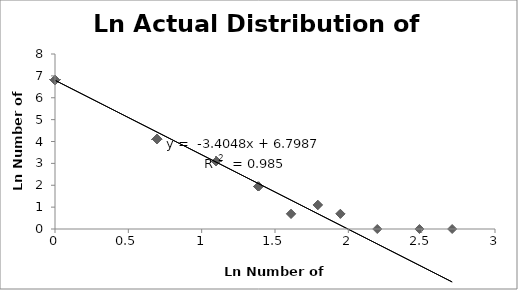
| Category | LnActual Number of Athletes |
|---|---|
| 2.70805 | 0 |
| 2.48491 | 0 |
| 2.19722 | 0 |
| 1.94591 | 0.693 |
| 1.94591 | 0.693 |
| 1.79176 | 1.099 |
| 1.79176 | 1.099 |
| 1.79176 | 1.099 |
| 1.60944 | 0.693 |
| 1.60944 | 0.693 |
| 1.38629 | 1.946 |
| 1.38629 | 1.946 |
| 1.38629 | 1.946 |
| 1.38629 | 1.946 |
| 1.38629 | 1.946 |
| 1.38629 | 1.946 |
| 1.38629 | 1.946 |
| 1.09861 | 3.091 |
| 1.09861 | 3.091 |
| 1.09861 | 3.091 |
| 1.09861 | 3.091 |
| 1.09861 | 3.091 |
| 1.09861 | 3.091 |
| 1.09861 | 3.091 |
| 1.09861 | 3.091 |
| 1.09861 | 3.091 |
| 1.09861 | 3.091 |
| 1.09861 | 3.091 |
| 1.09861 | 3.091 |
| 1.09861 | 3.091 |
| 1.09861 | 3.091 |
| 1.09861 | 3.091 |
| 1.09861 | 3.091 |
| 1.09861 | 3.091 |
| 1.09861 | 3.091 |
| 1.09861 | 3.091 |
| 1.09861 | 3.091 |
| 1.09861 | 3.091 |
| 1.09861 | 3.091 |
| 0.69315 | 4.111 |
| 0.69315 | 4.111 |
| 0.69315 | 4.111 |
| 0.69315 | 4.111 |
| 0.69315 | 4.111 |
| 0.69315 | 4.111 |
| 0.69315 | 4.111 |
| 0.69315 | 4.111 |
| 0.69315 | 4.111 |
| 0.69315 | 4.111 |
| 0.69315 | 4.111 |
| 0.69315 | 4.111 |
| 0.69315 | 4.111 |
| 0.69315 | 4.111 |
| 0.69315 | 4.111 |
| 0.69315 | 4.111 |
| 0.69315 | 4.111 |
| 0.69315 | 4.111 |
| 0.69315 | 4.111 |
| 0.69315 | 4.111 |
| 0.69315 | 4.111 |
| 0.69315 | 4.111 |
| 0.69315 | 4.111 |
| 0.69315 | 4.111 |
| 0.69315 | 4.111 |
| 0.69315 | 4.111 |
| 0.69315 | 4.111 |
| 0.69315 | 4.111 |
| 0.69315 | 4.111 |
| 0.69315 | 4.111 |
| 0.69315 | 4.111 |
| 0.69315 | 4.111 |
| 0.69315 | 4.111 |
| 0.69315 | 4.111 |
| 0.69315 | 4.111 |
| 0.69315 | 4.111 |
| 0.69315 | 4.111 |
| 0.69315 | 4.111 |
| 0.69315 | 4.111 |
| 0.69315 | 4.111 |
| 0.69315 | 4.111 |
| 0.69315 | 4.111 |
| 0.69315 | 4.111 |
| 0.69315 | 4.111 |
| 0.69315 | 4.111 |
| 0.69315 | 4.111 |
| 0.69315 | 4.111 |
| 0.69315 | 4.111 |
| 0.69315 | 4.111 |
| 0.69315 | 4.111 |
| 0.69315 | 4.111 |
| 0.69315 | 4.111 |
| 0.69315 | 4.111 |
| 0.69315 | 4.111 |
| 0.69315 | 4.111 |
| 0.69315 | 4.111 |
| 0.69315 | 4.111 |
| 0.69315 | 4.111 |
| 0.69315 | 4.111 |
| 0.69315 | 4.111 |
| 0.69315 | 4.111 |
| 0.0 | 6.815 |
| 0.0 | 6.815 |
| 0.0 | 6.815 |
| 0.0 | 6.815 |
| 0.0 | 6.815 |
| 0.0 | 6.815 |
| 0.0 | 6.815 |
| 0.0 | 6.815 |
| 0.0 | 6.815 |
| 0.0 | 6.815 |
| 0.0 | 6.815 |
| 0.0 | 6.815 |
| 0.0 | 6.815 |
| 0.0 | 6.815 |
| 0.0 | 6.815 |
| 0.0 | 6.815 |
| 0.0 | 6.815 |
| 0.0 | 6.815 |
| 0.0 | 6.815 |
| 0.0 | 6.815 |
| 0.0 | 6.815 |
| 0.0 | 6.815 |
| 0.0 | 6.815 |
| 0.0 | 6.815 |
| 0.0 | 6.815 |
| 0.0 | 6.815 |
| 0.0 | 6.815 |
| 0.0 | 6.815 |
| 0.0 | 6.815 |
| 0.0 | 6.815 |
| 0.0 | 6.815 |
| 0.0 | 6.815 |
| 0.0 | 6.815 |
| 0.0 | 6.815 |
| 0.0 | 6.815 |
| 0.0 | 6.815 |
| 0.0 | 6.815 |
| 0.0 | 6.815 |
| 0.0 | 6.815 |
| 0.0 | 6.815 |
| 0.0 | 6.815 |
| 0.0 | 6.815 |
| 0.0 | 6.815 |
| 0.0 | 6.815 |
| 0.0 | 6.815 |
| 0.0 | 6.815 |
| 0.0 | 6.815 |
| 0.0 | 6.815 |
| 0.0 | 6.815 |
| 0.0 | 6.815 |
| 0.0 | 6.815 |
| 0.0 | 6.815 |
| 0.0 | 6.815 |
| 0.0 | 6.815 |
| 0.0 | 6.815 |
| 0.0 | 6.815 |
| 0.0 | 6.815 |
| 0.0 | 6.815 |
| 0.0 | 6.815 |
| 0.0 | 6.815 |
| 0.0 | 6.815 |
| 0.0 | 6.815 |
| 0.0 | 6.815 |
| 0.0 | 6.815 |
| 0.0 | 6.815 |
| 0.0 | 6.815 |
| 0.0 | 6.815 |
| 0.0 | 6.815 |
| 0.0 | 6.815 |
| 0.0 | 6.815 |
| 0.0 | 6.815 |
| 0.0 | 6.815 |
| 0.0 | 6.815 |
| 0.0 | 6.815 |
| 0.0 | 6.815 |
| 0.0 | 6.815 |
| 0.0 | 6.815 |
| 0.0 | 6.815 |
| 0.0 | 6.815 |
| 0.0 | 6.815 |
| 0.0 | 6.815 |
| 0.0 | 6.815 |
| 0.0 | 6.815 |
| 0.0 | 6.815 |
| 0.0 | 6.815 |
| 0.0 | 6.815 |
| 0.0 | 6.815 |
| 0.0 | 6.815 |
| 0.0 | 6.815 |
| 0.0 | 6.815 |
| 0.0 | 6.815 |
| 0.0 | 6.815 |
| 0.0 | 6.815 |
| 0.0 | 6.815 |
| 0.0 | 6.815 |
| 0.0 | 6.815 |
| 0.0 | 6.815 |
| 0.0 | 6.815 |
| 0.0 | 6.815 |
| 0.0 | 6.815 |
| 0.0 | 6.815 |
| 0.0 | 6.815 |
| 0.0 | 6.815 |
| 0.0 | 6.815 |
| 0.0 | 6.815 |
| 0.0 | 6.815 |
| 0.0 | 6.815 |
| 0.0 | 6.815 |
| 0.0 | 6.815 |
| 0.0 | 6.815 |
| 0.0 | 6.815 |
| 0.0 | 6.815 |
| 0.0 | 6.815 |
| 0.0 | 6.815 |
| 0.0 | 6.815 |
| 0.0 | 6.815 |
| 0.0 | 6.815 |
| 0.0 | 6.815 |
| 0.0 | 6.815 |
| 0.0 | 6.815 |
| 0.0 | 6.815 |
| 0.0 | 6.815 |
| 0.0 | 6.815 |
| 0.0 | 6.815 |
| 0.0 | 6.815 |
| 0.0 | 6.815 |
| 0.0 | 6.815 |
| 0.0 | 6.815 |
| 0.0 | 6.815 |
| 0.0 | 6.815 |
| 0.0 | 6.815 |
| 0.0 | 6.815 |
| 0.0 | 6.815 |
| 0.0 | 6.815 |
| 0.0 | 6.815 |
| 0.0 | 6.815 |
| 0.0 | 6.815 |
| 0.0 | 6.815 |
| 0.0 | 6.815 |
| 0.0 | 6.815 |
| 0.0 | 6.815 |
| 0.0 | 6.815 |
| 0.0 | 6.815 |
| 0.0 | 6.815 |
| 0.0 | 6.815 |
| 0.0 | 6.815 |
| 0.0 | 6.815 |
| 0.0 | 6.815 |
| 0.0 | 6.815 |
| 0.0 | 6.815 |
| 0.0 | 6.815 |
| 0.0 | 6.815 |
| 0.0 | 6.815 |
| 0.0 | 6.815 |
| 0.0 | 6.815 |
| 0.0 | 6.815 |
| 0.0 | 6.815 |
| 0.0 | 6.815 |
| 0.0 | 6.815 |
| 0.0 | 6.815 |
| 0.0 | 6.815 |
| 0.0 | 6.815 |
| 0.0 | 6.815 |
| 0.0 | 6.815 |
| 0.0 | 6.815 |
| 0.0 | 6.815 |
| 0.0 | 6.815 |
| 0.0 | 6.815 |
| 0.0 | 6.815 |
| 0.0 | 6.815 |
| 0.0 | 6.815 |
| 0.0 | 6.815 |
| 0.0 | 6.815 |
| 0.0 | 6.815 |
| 0.0 | 6.815 |
| 0.0 | 6.815 |
| 0.0 | 6.815 |
| 0.0 | 6.815 |
| 0.0 | 6.815 |
| 0.0 | 6.815 |
| 0.0 | 6.815 |
| 0.0 | 6.815 |
| 0.0 | 6.815 |
| 0.0 | 6.815 |
| 0.0 | 6.815 |
| 0.0 | 6.815 |
| 0.0 | 6.815 |
| 0.0 | 6.815 |
| 0.0 | 6.815 |
| 0.0 | 6.815 |
| 0.0 | 6.815 |
| 0.0 | 6.815 |
| 0.0 | 6.815 |
| 0.0 | 6.815 |
| 0.0 | 6.815 |
| 0.0 | 6.815 |
| 0.0 | 6.815 |
| 0.0 | 6.815 |
| 0.0 | 6.815 |
| 0.0 | 6.815 |
| 0.0 | 6.815 |
| 0.0 | 6.815 |
| 0.0 | 6.815 |
| 0.0 | 6.815 |
| 0.0 | 6.815 |
| 0.0 | 6.815 |
| 0.0 | 6.815 |
| 0.0 | 6.815 |
| 0.0 | 6.815 |
| 0.0 | 6.815 |
| 0.0 | 6.815 |
| 0.0 | 6.815 |
| 0.0 | 6.815 |
| 0.0 | 6.815 |
| 0.0 | 6.815 |
| 0.0 | 6.815 |
| 0.0 | 6.815 |
| 0.0 | 6.815 |
| 0.0 | 6.815 |
| 0.0 | 6.815 |
| 0.0 | 6.815 |
| 0.0 | 6.815 |
| 0.0 | 6.815 |
| 0.0 | 6.815 |
| 0.0 | 6.815 |
| 0.0 | 6.815 |
| 0.0 | 6.815 |
| 0.0 | 6.815 |
| 0.0 | 6.815 |
| 0.0 | 6.815 |
| 0.0 | 6.815 |
| 0.0 | 6.815 |
| 0.0 | 6.815 |
| 0.0 | 6.815 |
| 0.0 | 6.815 |
| 0.0 | 6.815 |
| 0.0 | 6.815 |
| 0.0 | 6.815 |
| 0.0 | 6.815 |
| 0.0 | 6.815 |
| 0.0 | 6.815 |
| 0.0 | 6.815 |
| 0.0 | 6.815 |
| 0.0 | 6.815 |
| 0.0 | 6.815 |
| 0.0 | 6.815 |
| 0.0 | 6.815 |
| 0.0 | 6.815 |
| 0.0 | 6.815 |
| 0.0 | 6.815 |
| 0.0 | 6.815 |
| 0.0 | 6.815 |
| 0.0 | 6.815 |
| 0.0 | 6.815 |
| 0.0 | 6.815 |
| 0.0 | 6.815 |
| 0.0 | 6.815 |
| 0.0 | 6.815 |
| 0.0 | 6.815 |
| 0.0 | 6.815 |
| 0.0 | 6.815 |
| 0.0 | 6.815 |
| 0.0 | 6.815 |
| 0.0 | 6.815 |
| 0.0 | 6.815 |
| 0.0 | 6.815 |
| 0.0 | 6.815 |
| 0.0 | 6.815 |
| 0.0 | 6.815 |
| 0.0 | 6.815 |
| 0.0 | 6.815 |
| 0.0 | 6.815 |
| 0.0 | 6.815 |
| 0.0 | 6.815 |
| 0.0 | 6.815 |
| 0.0 | 6.815 |
| 0.0 | 6.815 |
| 0.0 | 6.815 |
| 0.0 | 6.815 |
| 0.0 | 6.815 |
| 0.0 | 6.815 |
| 0.0 | 6.815 |
| 0.0 | 6.815 |
| 0.0 | 6.815 |
| 0.0 | 6.815 |
| 0.0 | 6.815 |
| 0.0 | 6.815 |
| 0.0 | 6.815 |
| 0.0 | 6.815 |
| 0.0 | 6.815 |
| 0.0 | 6.815 |
| 0.0 | 6.815 |
| 0.0 | 6.815 |
| 0.0 | 6.815 |
| 0.0 | 6.815 |
| 0.0 | 6.815 |
| 0.0 | 6.815 |
| 0.0 | 6.815 |
| 0.0 | 6.815 |
| 0.0 | 6.815 |
| 0.0 | 6.815 |
| 0.0 | 6.815 |
| 0.0 | 6.815 |
| 0.0 | 6.815 |
| 0.0 | 6.815 |
| 0.0 | 6.815 |
| 0.0 | 6.815 |
| 0.0 | 6.815 |
| 0.0 | 6.815 |
| 0.0 | 6.815 |
| 0.0 | 6.815 |
| 0.0 | 6.815 |
| 0.0 | 6.815 |
| 0.0 | 6.815 |
| 0.0 | 6.815 |
| 0.0 | 6.815 |
| 0.0 | 6.815 |
| 0.0 | 6.815 |
| 0.0 | 6.815 |
| 0.0 | 6.815 |
| 0.0 | 6.815 |
| 0.0 | 6.815 |
| 0.0 | 6.815 |
| 0.0 | 6.815 |
| 0.0 | 6.815 |
| 0.0 | 6.815 |
| 0.0 | 6.815 |
| 0.0 | 6.815 |
| 0.0 | 6.815 |
| 0.0 | 6.815 |
| 0.0 | 6.815 |
| 0.0 | 6.815 |
| 0.0 | 6.815 |
| 0.0 | 6.815 |
| 0.0 | 6.815 |
| 0.0 | 6.815 |
| 0.0 | 6.815 |
| 0.0 | 6.815 |
| 0.0 | 6.815 |
| 0.0 | 6.815 |
| 0.0 | 6.815 |
| 0.0 | 6.815 |
| 0.0 | 6.815 |
| 0.0 | 6.815 |
| 0.0 | 6.815 |
| 0.0 | 6.815 |
| 0.0 | 6.815 |
| 0.0 | 6.815 |
| 0.0 | 6.815 |
| 0.0 | 6.815 |
| 0.0 | 6.815 |
| 0.0 | 6.815 |
| 0.0 | 6.815 |
| 0.0 | 6.815 |
| 0.0 | 6.815 |
| 0.0 | 6.815 |
| 0.0 | 6.815 |
| 0.0 | 6.815 |
| 0.0 | 6.815 |
| 0.0 | 6.815 |
| 0.0 | 6.815 |
| 0.0 | 6.815 |
| 0.0 | 6.815 |
| 0.0 | 6.815 |
| 0.0 | 6.815 |
| 0.0 | 6.815 |
| 0.0 | 6.815 |
| 0.0 | 6.815 |
| 0.0 | 6.815 |
| 0.0 | 6.815 |
| 0.0 | 6.815 |
| 0.0 | 6.815 |
| 0.0 | 6.815 |
| 0.0 | 6.815 |
| 0.0 | 6.815 |
| 0.0 | 6.815 |
| 0.0 | 6.815 |
| 0.0 | 6.815 |
| 0.0 | 6.815 |
| 0.0 | 6.815 |
| 0.0 | 6.815 |
| 0.0 | 6.815 |
| 0.0 | 6.815 |
| 0.0 | 6.815 |
| 0.0 | 6.815 |
| 0.0 | 6.815 |
| 0.0 | 6.815 |
| 0.0 | 6.815 |
| 0.0 | 6.815 |
| 0.0 | 6.815 |
| 0.0 | 6.815 |
| 0.0 | 6.815 |
| 0.0 | 6.815 |
| 0.0 | 6.815 |
| 0.0 | 6.815 |
| 0.0 | 6.815 |
| 0.0 | 6.815 |
| 0.0 | 6.815 |
| 0.0 | 6.815 |
| 0.0 | 6.815 |
| 0.0 | 6.815 |
| 0.0 | 6.815 |
| 0.0 | 6.815 |
| 0.0 | 6.815 |
| 0.0 | 6.815 |
| 0.0 | 6.815 |
| 0.0 | 6.815 |
| 0.0 | 6.815 |
| 0.0 | 6.815 |
| 0.0 | 6.815 |
| 0.0 | 6.815 |
| 0.0 | 6.815 |
| 0.0 | 6.815 |
| 0.0 | 6.815 |
| 0.0 | 6.815 |
| 0.0 | 6.815 |
| 0.0 | 6.815 |
| 0.0 | 6.815 |
| 0.0 | 6.815 |
| 0.0 | 6.815 |
| 0.0 | 6.815 |
| 0.0 | 6.815 |
| 0.0 | 6.815 |
| 0.0 | 6.815 |
| 0.0 | 6.815 |
| 0.0 | 6.815 |
| 0.0 | 6.815 |
| 0.0 | 6.815 |
| 0.0 | 6.815 |
| 0.0 | 6.815 |
| 0.0 | 6.815 |
| 0.0 | 6.815 |
| 0.0 | 6.815 |
| 0.0 | 6.815 |
| 0.0 | 6.815 |
| 0.0 | 6.815 |
| 0.0 | 6.815 |
| 0.0 | 6.815 |
| 0.0 | 6.815 |
| 0.0 | 6.815 |
| 0.0 | 6.815 |
| 0.0 | 6.815 |
| 0.0 | 6.815 |
| 0.0 | 6.815 |
| 0.0 | 6.815 |
| 0.0 | 6.815 |
| 0.0 | 6.815 |
| 0.0 | 6.815 |
| 0.0 | 6.815 |
| 0.0 | 6.815 |
| 0.0 | 6.815 |
| 0.0 | 6.815 |
| 0.0 | 6.815 |
| 0.0 | 6.815 |
| 0.0 | 6.815 |
| 0.0 | 6.815 |
| 0.0 | 6.815 |
| 0.0 | 6.815 |
| 0.0 | 6.815 |
| 0.0 | 6.815 |
| 0.0 | 6.815 |
| 0.0 | 6.815 |
| 0.0 | 6.815 |
| 0.0 | 6.815 |
| 0.0 | 6.815 |
| 0.0 | 6.815 |
| 0.0 | 6.815 |
| 0.0 | 6.815 |
| 0.0 | 6.815 |
| 0.0 | 6.815 |
| 0.0 | 6.815 |
| 0.0 | 6.815 |
| 0.0 | 6.815 |
| 0.0 | 6.815 |
| 0.0 | 6.815 |
| 0.0 | 6.815 |
| 0.0 | 6.815 |
| 0.0 | 6.815 |
| 0.0 | 6.815 |
| 0.0 | 6.815 |
| 0.0 | 6.815 |
| 0.0 | 6.815 |
| 0.0 | 6.815 |
| 0.0 | 6.815 |
| 0.0 | 6.815 |
| 0.0 | 6.815 |
| 0.0 | 6.815 |
| 0.0 | 6.815 |
| 0.0 | 6.815 |
| 0.0 | 6.815 |
| 0.0 | 6.815 |
| 0.0 | 6.815 |
| 0.0 | 6.815 |
| 0.0 | 6.815 |
| 0.0 | 6.815 |
| 0.0 | 6.815 |
| 0.0 | 6.815 |
| 0.0 | 6.815 |
| 0.0 | 6.815 |
| 0.0 | 6.815 |
| 0.0 | 6.815 |
| 0.0 | 6.815 |
| 0.0 | 6.815 |
| 0.0 | 6.815 |
| 0.0 | 6.815 |
| 0.0 | 6.815 |
| 0.0 | 6.815 |
| 0.0 | 6.815 |
| 0.0 | 6.815 |
| 0.0 | 6.815 |
| 0.0 | 6.815 |
| 0.0 | 6.815 |
| 0.0 | 6.815 |
| 0.0 | 6.815 |
| 0.0 | 6.815 |
| 0.0 | 6.815 |
| 0.0 | 6.815 |
| 0.0 | 6.815 |
| 0.0 | 6.815 |
| 0.0 | 6.815 |
| 0.0 | 6.815 |
| 0.0 | 6.815 |
| 0.0 | 6.815 |
| 0.0 | 6.815 |
| 0.0 | 6.815 |
| 0.0 | 6.815 |
| 0.0 | 6.815 |
| 0.0 | 6.815 |
| 0.0 | 6.815 |
| 0.0 | 6.815 |
| 0.0 | 6.815 |
| 0.0 | 6.815 |
| 0.0 | 6.815 |
| 0.0 | 6.815 |
| 0.0 | 6.815 |
| 0.0 | 6.815 |
| 0.0 | 6.815 |
| 0.0 | 6.815 |
| 0.0 | 6.815 |
| 0.0 | 6.815 |
| 0.0 | 6.815 |
| 0.0 | 6.815 |
| 0.0 | 6.815 |
| 0.0 | 6.815 |
| 0.0 | 6.815 |
| 0.0 | 6.815 |
| 0.0 | 6.815 |
| 0.0 | 6.815 |
| 0.0 | 6.815 |
| 0.0 | 6.815 |
| 0.0 | 6.815 |
| 0.0 | 6.815 |
| 0.0 | 6.815 |
| 0.0 | 6.815 |
| 0.0 | 6.815 |
| 0.0 | 6.815 |
| 0.0 | 6.815 |
| 0.0 | 6.815 |
| 0.0 | 6.815 |
| 0.0 | 6.815 |
| 0.0 | 6.815 |
| 0.0 | 6.815 |
| 0.0 | 6.815 |
| 0.0 | 6.815 |
| 0.0 | 6.815 |
| 0.0 | 6.815 |
| 0.0 | 6.815 |
| 0.0 | 6.815 |
| 0.0 | 6.815 |
| 0.0 | 6.815 |
| 0.0 | 6.815 |
| 0.0 | 6.815 |
| 0.0 | 6.815 |
| 0.0 | 6.815 |
| 0.0 | 6.815 |
| 0.0 | 6.815 |
| 0.0 | 6.815 |
| 0.0 | 6.815 |
| 0.0 | 6.815 |
| 0.0 | 6.815 |
| 0.0 | 6.815 |
| 0.0 | 6.815 |
| 0.0 | 6.815 |
| 0.0 | 6.815 |
| 0.0 | 6.815 |
| 0.0 | 6.815 |
| 0.0 | 6.815 |
| 0.0 | 6.815 |
| 0.0 | 6.815 |
| 0.0 | 6.815 |
| 0.0 | 6.815 |
| 0.0 | 6.815 |
| 0.0 | 6.815 |
| 0.0 | 6.815 |
| 0.0 | 6.815 |
| 0.0 | 6.815 |
| 0.0 | 6.815 |
| 0.0 | 6.815 |
| 0.0 | 6.815 |
| 0.0 | 6.815 |
| 0.0 | 6.815 |
| 0.0 | 6.815 |
| 0.0 | 6.815 |
| 0.0 | 6.815 |
| 0.0 | 6.815 |
| 0.0 | 6.815 |
| 0.0 | 6.815 |
| 0.0 | 6.815 |
| 0.0 | 6.815 |
| 0.0 | 6.815 |
| 0.0 | 6.815 |
| 0.0 | 6.815 |
| 0.0 | 6.815 |
| 0.0 | 6.815 |
| 0.0 | 6.815 |
| 0.0 | 6.815 |
| 0.0 | 6.815 |
| 0.0 | 6.815 |
| 0.0 | 6.815 |
| 0.0 | 6.815 |
| 0.0 | 6.815 |
| 0.0 | 6.815 |
| 0.0 | 6.815 |
| 0.0 | 6.815 |
| 0.0 | 6.815 |
| 0.0 | 6.815 |
| 0.0 | 6.815 |
| 0.0 | 6.815 |
| 0.0 | 6.815 |
| 0.0 | 6.815 |
| 0.0 | 6.815 |
| 0.0 | 6.815 |
| 0.0 | 6.815 |
| 0.0 | 6.815 |
| 0.0 | 6.815 |
| 0.0 | 6.815 |
| 0.0 | 6.815 |
| 0.0 | 6.815 |
| 0.0 | 6.815 |
| 0.0 | 6.815 |
| 0.0 | 6.815 |
| 0.0 | 6.815 |
| 0.0 | 6.815 |
| 0.0 | 6.815 |
| 0.0 | 6.815 |
| 0.0 | 6.815 |
| 0.0 | 6.815 |
| 0.0 | 6.815 |
| 0.0 | 6.815 |
| 0.0 | 6.815 |
| 0.0 | 6.815 |
| 0.0 | 6.815 |
| 0.0 | 6.815 |
| 0.0 | 6.815 |
| 0.0 | 6.815 |
| 0.0 | 6.815 |
| 0.0 | 6.815 |
| 0.0 | 6.815 |
| 0.0 | 6.815 |
| 0.0 | 6.815 |
| 0.0 | 6.815 |
| 0.0 | 6.815 |
| 0.0 | 6.815 |
| 0.0 | 6.815 |
| 0.0 | 6.815 |
| 0.0 | 6.815 |
| 0.0 | 6.815 |
| 0.0 | 6.815 |
| 0.0 | 6.815 |
| 0.0 | 6.815 |
| 0.0 | 6.815 |
| 0.0 | 6.815 |
| 0.0 | 6.815 |
| 0.0 | 6.815 |
| 0.0 | 6.815 |
| 0.0 | 6.815 |
| 0.0 | 6.815 |
| 0.0 | 6.815 |
| 0.0 | 6.815 |
| 0.0 | 6.815 |
| 0.0 | 6.815 |
| 0.0 | 6.815 |
| 0.0 | 6.815 |
| 0.0 | 6.815 |
| 0.0 | 6.815 |
| 0.0 | 6.815 |
| 0.0 | 6.815 |
| 0.0 | 6.815 |
| 0.0 | 6.815 |
| 0.0 | 6.815 |
| 0.0 | 6.815 |
| 0.0 | 6.815 |
| 0.0 | 6.815 |
| 0.0 | 6.815 |
| 0.0 | 6.815 |
| 0.0 | 6.815 |
| 0.0 | 6.815 |
| 0.0 | 6.815 |
| 0.0 | 6.815 |
| 0.0 | 6.815 |
| 0.0 | 6.815 |
| 0.0 | 6.815 |
| 0.0 | 6.815 |
| 0.0 | 6.815 |
| 0.0 | 6.815 |
| 0.0 | 6.815 |
| 0.0 | 6.815 |
| 0.0 | 6.815 |
| 0.0 | 6.815 |
| 0.0 | 6.815 |
| 0.0 | 6.815 |
| 0.0 | 6.815 |
| 0.0 | 6.815 |
| 0.0 | 6.815 |
| 0.0 | 6.815 |
| 0.0 | 6.815 |
| 0.0 | 6.815 |
| 0.0 | 6.815 |
| 0.0 | 6.815 |
| 0.0 | 6.815 |
| 0.0 | 6.815 |
| 0.0 | 6.815 |
| 0.0 | 6.815 |
| 0.0 | 6.815 |
| 0.0 | 6.815 |
| 0.0 | 6.815 |
| 0.0 | 6.815 |
| 0.0 | 6.815 |
| 0.0 | 6.815 |
| 0.0 | 6.815 |
| 0.0 | 6.815 |
| 0.0 | 6.815 |
| 0.0 | 6.815 |
| 0.0 | 6.815 |
| 0.0 | 6.815 |
| 0.0 | 6.815 |
| 0.0 | 6.815 |
| 0.0 | 6.815 |
| 0.0 | 6.815 |
| 0.0 | 6.815 |
| 0.0 | 6.815 |
| 0.0 | 6.815 |
| 0.0 | 6.815 |
| 0.0 | 6.815 |
| 0.0 | 6.815 |
| 0.0 | 6.815 |
| 0.0 | 6.815 |
| 0.0 | 6.815 |
| 0.0 | 6.815 |
| 0.0 | 6.815 |
| 0.0 | 6.815 |
| 0.0 | 6.815 |
| 0.0 | 6.815 |
| 0.0 | 6.815 |
| 0.0 | 6.815 |
| 0.0 | 6.815 |
| 0.0 | 6.815 |
| 0.0 | 6.815 |
| 0.0 | 6.815 |
| 0.0 | 6.815 |
| 0.0 | 6.815 |
| 0.0 | 6.815 |
| 0.0 | 6.815 |
| 0.0 | 6.815 |
| 0.0 | 6.815 |
| 0.0 | 6.815 |
| 0.0 | 6.815 |
| 0.0 | 6.815 |
| 0.0 | 6.815 |
| 0.0 | 6.815 |
| 0.0 | 6.815 |
| 0.0 | 6.815 |
| 0.0 | 6.815 |
| 0.0 | 6.815 |
| 0.0 | 6.815 |
| 0.0 | 6.815 |
| 0.0 | 6.815 |
| 0.0 | 6.815 |
| 0.0 | 6.815 |
| 0.0 | 6.815 |
| 0.0 | 6.815 |
| 0.0 | 6.815 |
| 0.0 | 6.815 |
| 0.0 | 6.815 |
| 0.0 | 6.815 |
| 0.0 | 6.815 |
| 0.0 | 6.815 |
| 0.0 | 6.815 |
| 0.0 | 6.815 |
| 0.0 | 6.815 |
| 0.0 | 6.815 |
| 0.0 | 6.815 |
| 0.0 | 6.815 |
| 0.0 | 6.815 |
| 0.0 | 6.815 |
| 0.0 | 6.815 |
| 0.0 | 6.815 |
| 0.0 | 6.815 |
| 0.0 | 6.815 |
| 0.0 | 6.815 |
| 0.0 | 6.815 |
| 0.0 | 6.815 |
| 0.0 | 6.815 |
| 0.0 | 6.815 |
| 0.0 | 6.815 |
| 0.0 | 6.815 |
| 0.0 | 6.815 |
| 0.0 | 6.815 |
| 0.0 | 6.815 |
| 0.0 | 6.815 |
| 0.0 | 6.815 |
| 0.0 | 6.815 |
| 0.0 | 6.815 |
| 0.0 | 6.815 |
| 0.0 | 6.815 |
| 0.0 | 6.815 |
| 0.0 | 6.815 |
| 0.0 | 6.815 |
| 0.0 | 6.815 |
| 0.0 | 6.815 |
| 0.0 | 6.815 |
| 0.0 | 6.815 |
| 0.0 | 6.815 |
| 0.0 | 6.815 |
| 0.0 | 6.815 |
| 0.0 | 6.815 |
| 0.0 | 6.815 |
| 0.0 | 6.815 |
| 0.0 | 6.815 |
| 0.0 | 6.815 |
| 0.0 | 6.815 |
| 0.0 | 6.815 |
| 0.0 | 6.815 |
| 0.0 | 6.815 |
| 0.0 | 6.815 |
| 0.0 | 6.815 |
| 0.0 | 6.815 |
| 0.0 | 6.815 |
| 0.0 | 6.815 |
| 0.0 | 6.815 |
| 0.0 | 6.815 |
| 0.0 | 6.815 |
| 0.0 | 6.815 |
| 0.0 | 6.815 |
| 0.0 | 6.815 |
| 0.0 | 6.815 |
| 0.0 | 6.815 |
| 0.0 | 6.815 |
| 0.0 | 6.815 |
| 0.0 | 6.815 |
| 0.0 | 6.815 |
| 0.0 | 6.815 |
| 0.0 | 6.815 |
| 0.0 | 6.815 |
| 0.0 | 6.815 |
| 0.0 | 6.815 |
| 0.0 | 6.815 |
| 0.0 | 6.815 |
| 0.0 | 6.815 |
| 0.0 | 6.815 |
| 0.0 | 6.815 |
| 0.0 | 6.815 |
| 0.0 | 6.815 |
| 0.0 | 6.815 |
| 0.0 | 6.815 |
| 0.0 | 6.815 |
| 0.0 | 6.815 |
| 0.0 | 6.815 |
| 0.0 | 6.815 |
| 0.0 | 6.815 |
| 0.0 | 6.815 |
| 0.0 | 6.815 |
| 0.0 | 6.815 |
| 0.0 | 6.815 |
| 0.0 | 6.815 |
| 0.0 | 6.815 |
| 0.0 | 6.815 |
| 0.0 | 6.815 |
| 0.0 | 6.815 |
| 0.0 | 6.815 |
| 0.0 | 6.815 |
| 0.0 | 6.815 |
| 0.0 | 6.815 |
| 0.0 | 6.815 |
| 0.0 | 6.815 |
| 0.0 | 6.815 |
| 0.0 | 6.815 |
| 0.0 | 6.815 |
| 0.0 | 6.815 |
| 0.0 | 6.815 |
| 0.0 | 6.815 |
| 0.0 | 6.815 |
| 0.0 | 6.815 |
| 0.0 | 6.815 |
| 0.0 | 6.815 |
| 0.0 | 6.815 |
| 0.0 | 6.815 |
| 0.0 | 6.815 |
| 0.0 | 6.815 |
| 0.0 | 6.815 |
| 0.0 | 6.815 |
| 0.0 | 6.815 |
| 0.0 | 6.815 |
| 0.0 | 6.815 |
| 0.0 | 6.815 |
| 0.0 | 6.815 |
| 0.0 | 6.815 |
| 0.0 | 6.815 |
| 0.0 | 6.815 |
| 0.0 | 6.815 |
| 0.0 | 6.815 |